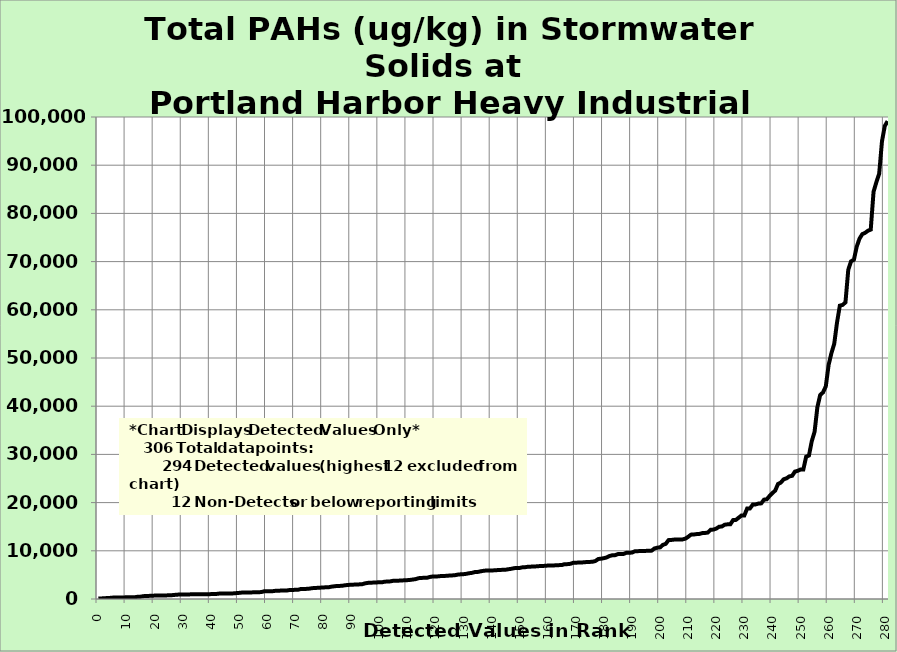
| Category | Total PAHs |
|---|---|
| 0.0 | 102.3 |
| 1.0 | 121.1 |
| 2.0 | 149 |
| 3.0 | 197 |
| 4.0 | 221 |
| 5.0 | 284 |
| 6.0 | 313 |
| 7.0 | 316.2 |
| 8.0 | 317 |
| 9.0 | 329 |
| 10.0 | 350 |
| 11.0 | 352 |
| 12.0 | 357.1 |
| 13.0 | 365.6 |
| 14.0 | 467.2 |
| 15.0 | 485.7 |
| 16.0 | 589.4 |
| 17.0 | 624 |
| 18.0 | 644.9 |
| 19.0 | 679 |
| 20.0 | 704 |
| 21.0 | 712.5 |
| 22.0 | 713 |
| 23.0 | 725 |
| 24.0 | 745.5 |
| 25.0 | 761 |
| 26.0 | 784.3 |
| 27.0 | 838.26 |
| 28.0 | 904.9 |
| 29.0 | 913 |
| 30.0 | 938.1 |
| 31.0 | 944.82 |
| 32.0 | 951.7 |
| 33.0 | 964 |
| 34.0 | 966.6 |
| 35.0 | 967.3 |
| 36.0 | 980 |
| 37.0 | 988.22 |
| 38.0 | 990.2 |
| 39.0 | 1002 |
| 40.0 | 1012 |
| 41.0 | 1022.23 |
| 42.0 | 1050 |
| 43.0 | 1122 |
| 44.0 | 1129 |
| 45.0 | 1148 |
| 46.0 | 1152.8 |
| 47.0 | 1165.9 |
| 48.0 | 1166.2 |
| 49.0 | 1219.2 |
| 50.0 | 1265.1 |
| 51.0 | 1331.3 |
| 52.0 | 1347 |
| 53.0 | 1351 |
| 54.0 | 1360 |
| 55.0 | 1378.2 |
| 56.0 | 1400 |
| 57.0 | 1418 |
| 58.0 | 1430.9 |
| 59.0 | 1601.67 |
| 60.0 | 1602 |
| 61.0 | 1615 |
| 62.0 | 1617 |
| 63.0 | 1695.8 |
| 64.0 | 1715.6 |
| 65.0 | 1746 |
| 66.0 | 1752.3 |
| 67.0 | 1756 |
| 68.0 | 1856.1 |
| 69.0 | 1883 |
| 70.0 | 1896.6 |
| 71.0 | 1900 |
| 72.0 | 2065 |
| 73.0 | 2083 |
| 74.0 | 2098 |
| 75.0 | 2139.4 |
| 76.0 | 2240.2 |
| 77.0 | 2290 |
| 78.0 | 2314.8 |
| 79.0 | 2354.7 |
| 80.0 | 2383 |
| 81.0 | 2437.5 |
| 82.0 | 2441.1 |
| 83.0 | 2567 |
| 84.0 | 2636.2 |
| 85.0 | 2712 |
| 86.0 | 2717 |
| 87.0 | 2766.7 |
| 88.0 | 2864.4 |
| 89.0 | 2909.8 |
| 90.0 | 2973.57 |
| 91.0 | 2983 |
| 92.0 | 3009.4 |
| 93.0 | 3038.35 |
| 94.0 | 3083.11 |
| 95.0 | 3253 |
| 96.0 | 3346.1 |
| 97.0 | 3379 |
| 98.0 | 3410.2 |
| 99.0 | 3448.1 |
| 100.0 | 3450 |
| 101.0 | 3471.3 |
| 102.0 | 3600 |
| 103.0 | 3615 |
| 104.0 | 3661.8 |
| 105.0 | 3786 |
| 106.0 | 3786 |
| 107.0 | 3810 |
| 108.0 | 3845 |
| 109.0 | 3880 |
| 110.0 | 3910 |
| 111.0 | 3961.3 |
| 112.0 | 4040.7 |
| 113.0 | 4130 |
| 114.0 | 4319.3 |
| 115.0 | 4372 |
| 116.0 | 4398 |
| 117.0 | 4409 |
| 118.0 | 4567 |
| 119.0 | 4666 |
| 120.0 | 4670 |
| 121.0 | 4699 |
| 122.0 | 4771 |
| 123.0 | 4793.6 |
| 124.0 | 4800 |
| 125.0 | 4867 |
| 126.0 | 4892.7 |
| 127.0 | 4946 |
| 128.0 | 5062 |
| 129.0 | 5123 |
| 130.0 | 5147 |
| 131.0 | 5225 |
| 132.0 | 5347 |
| 133.0 | 5418.5 |
| 134.0 | 5582 |
| 135.0 | 5603.23 |
| 136.0 | 5734 |
| 137.0 | 5834.5 |
| 138.0 | 5908 |
| 139.0 | 5916 |
| 140.0 | 5924 |
| 141.0 | 5945 |
| 142.0 | 5991.6 |
| 143.0 | 6008 |
| 144.0 | 6073 |
| 145.0 | 6075 |
| 146.0 | 6180 |
| 147.0 | 6260 |
| 148.0 | 6397.2 |
| 149.0 | 6436 |
| 150.0 | 6443 |
| 151.0 | 6578 |
| 152.0 | 6604.3 |
| 153.0 | 6695 |
| 154.0 | 6714.3 |
| 155.0 | 6754 |
| 156.0 | 6772 |
| 157.0 | 6827 |
| 158.0 | 6857 |
| 159.0 | 6879 |
| 160.0 | 6936.5 |
| 161.0 | 6939 |
| 162.0 | 6945.7 |
| 163.0 | 7020 |
| 164.0 | 7027.1 |
| 165.0 | 7040 |
| 166.0 | 7229 |
| 167.0 | 7233.2 |
| 168.0 | 7292.3 |
| 169.0 | 7497.5 |
| 170.0 | 7531.7 |
| 171.0 | 7560 |
| 172.0 | 7577 |
| 173.0 | 7622 |
| 174.0 | 7680 |
| 175.0 | 7691 |
| 176.0 | 7739 |
| 177.0 | 7891 |
| 178.0 | 8295 |
| 179.0 | 8366 |
| 180.0 | 8472 |
| 181.0 | 8629.3 |
| 182.0 | 8920 |
| 183.0 | 9077 |
| 184.0 | 9096 |
| 185.0 | 9320 |
| 186.0 | 9356 |
| 187.0 | 9357 |
| 188.0 | 9590 |
| 189.0 | 9599 |
| 190.0 | 9632 |
| 191.0 | 9900 |
| 192.0 | 9916 |
| 193.0 | 9966 |
| 194.0 | 9984 |
| 195.0 | 9984 |
| 196.0 | 10003 |
| 197.0 | 10036 |
| 198.0 | 10491 |
| 199.0 | 10644 |
| 200.0 | 10710 |
| 201.0 | 11237 |
| 202.0 | 11434.3 |
| 203.0 | 12217 |
| 204.0 | 12253 |
| 205.0 | 12328 |
| 206.0 | 12340 |
| 207.0 | 12355.8 |
| 208.0 | 12366 |
| 209.0 | 12518 |
| 210.0 | 12910 |
| 211.0 | 13355 |
| 212.0 | 13382 |
| 213.0 | 13468 |
| 214.0 | 13503 |
| 215.0 | 13668 |
| 216.0 | 13700 |
| 217.0 | 13789.62 |
| 218.0 | 14369 |
| 219.0 | 14401 |
| 220.0 | 14607 |
| 221.0 | 14989 |
| 222.0 | 15050 |
| 223.0 | 15414 |
| 224.0 | 15490 |
| 225.0 | 15500 |
| 226.0 | 16370 |
| 227.0 | 16411 |
| 228.0 | 16880 |
| 229.0 | 17340 |
| 230.0 | 17343 |
| 231.0 | 18793 |
| 232.0 | 18800 |
| 233.0 | 19590 |
| 234.0 | 19624.2 |
| 235.0 | 19796 |
| 236.0 | 19840 |
| 237.0 | 20613 |
| 238.0 | 20690 |
| 239.0 | 21401 |
| 240.0 | 21982 |
| 241.0 | 22511 |
| 242.0 | 23873.3 |
| 243.0 | 24166 |
| 244.0 | 24840 |
| 245.0 | 25029 |
| 246.0 | 25436 |
| 247.0 | 25552 |
| 248.0 | 26426 |
| 249.0 | 26597 |
| 250.0 | 26863 |
| 251.0 | 26880 |
| 252.0 | 29522 |
| 253.0 | 29768 |
| 254.0 | 32750 |
| 255.0 | 34680 |
| 256.0 | 39793 |
| 257.0 | 42340 |
| 258.0 | 42852 |
| 259.0 | 44120 |
| 260.0 | 48560 |
| 261.0 | 51014 |
| 262.0 | 52950 |
| 263.0 | 57400 |
| 264.0 | 60860 |
| 265.0 | 61016 |
| 266.0 | 61549 |
| 267.0 | 68307 |
| 268.0 | 70060 |
| 269.0 | 70383 |
| 270.0 | 73090 |
| 271.0 | 74764 |
| 272.0 | 75702 |
| 273.0 | 75973 |
| 274.0 | 76402 |
| 275.0 | 76640 |
| 276.0 | 84500 |
| 277.0 | 86463 |
| 278.0 | 88210 |
| 279.0 | 94950 |
| 280.0 | 98140 |
| 281.0 | 99130 |